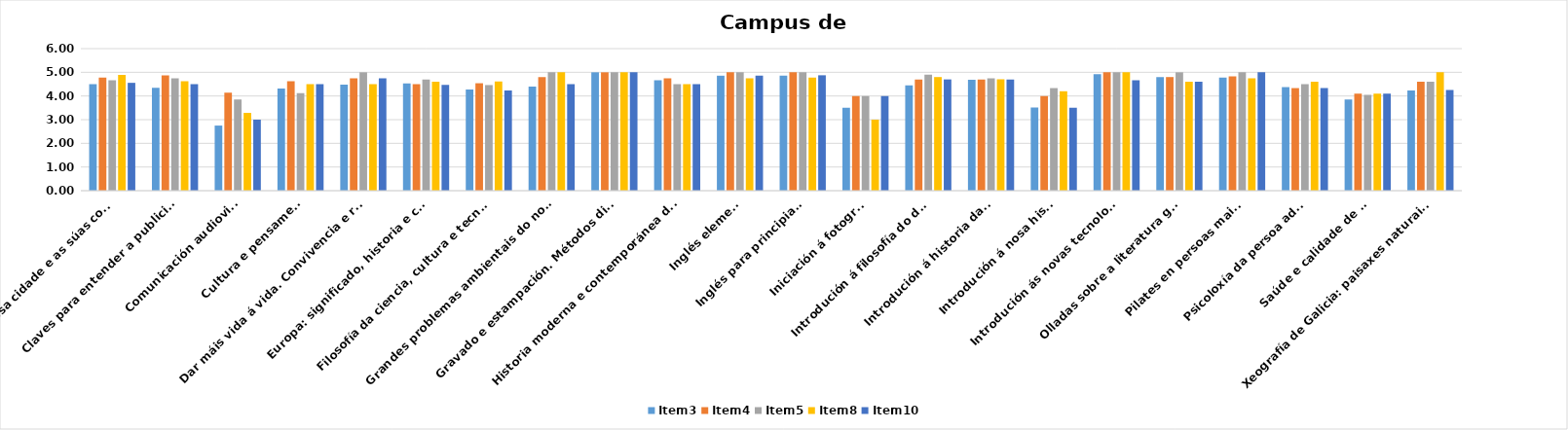
| Category | Item3 | Item4 | Item5 | Item8 | Item10 |
|---|---|---|---|---|---|
| A xenética na Humanidade | 4.472 | 4.364 | 4.545 | 4.417 | 4.273 |
| Aforro e investimento en economías domésticas | 4.292 | 4.667 | 4.5 | 4.5 | 4.318 |
| Aproximación á linguaxe da comunidade xorda española | 4.45 | 4.7 | 4.778 | 4.5 | 4.7 |
| As vanguardias históricas: da ilusión ao excepticismo | 4.641 | 4.719 | 4.781 | 4.667 | 4.667 |
| Bioloxía humana e saúde | 4.544 | 4.785 | 4.776 | 4.683 | 4.682 |
| Botánica Aplicada | 4.786 | 4.85 | 4.85 | 4.762 | 4.842 |
| Ciencia e conservación do patrimonio | 4.727 | 5 | 4.909 | 4.909 | 4.727 |
| Civilización e xeometría | 3.78 | 3.929 | 4 | 3.857 | 4.074 |
| Historia da ciencia, tecnoloxía e cultura: ata o século XIV | 4.549 | 4.615 | 4.667 | 4.478 | 4.556 |
| Historia da Química | 4.423 | 4.462 | 4.385 | 4.583 | 4.545 |
| Historia de Galicia | 3.5 | 3.778 | 3.444 | 3.375 | 3.333 |
| Inglés I | 4.061 | 4.364 | 4.1 | 4.5 | 4.3 |
| Inglés II | 4.833 | 5 | 5 | 4.75 | 4.75 |
| Inglés III | 4.546 | 4.842 | 4.9 | 4.7 | 4.8 |
| Introdución á elaboración de guións cinematográficos | 4.851 | 4.929 | 4.923 | 4.857 | 4.857 |
| Introdución á informática | 3.955 | 4.556 | 4.455 | 4.182 | 4.182 |
| Introdución ás novas tecnoloxías II | 4.792 | 4.75 | 5 | 4 | 4.5 |
| Lingua galega | 4.417 | 4.5 | 4.583 | 4.333 | 4.545 |
| Linguaxe musical e educación auditiva | 4.346 | 4.667 | 4.692 | 4.583 | 4.538 |
| Linguaxe musical e educación auditiva II | 4.5 | 4.875 | 4.889 | 4.75 | 4.75 |
| Matemáticas recreativas | 3.75 | 4 | 3.8 | 4 | 4 |
| Miguel de Cervantes: novelas exemplares | 4.659 | 4.71 | 4.806 | 4.679 | 4.741 |
| Mitoloxía e épica xermánicas | 4.652 | 4.576 | 4.688 | 4.786 | 4.545 |
| Novas Tecnoloxías | 4.553 | 4.818 | 4.727 | 4.455 | 4.6 |
| Olladas sobre a literatura galega | 4.55 | 4.889 | 4.8 | 4.7 | 4.9 |
| Panorámica do cine español dos anos 50 | 4.663 | 4.7 | 4.619 | 4.619 | 4.667 |
| Pensamento racional e científico | 4.217 | 4.35 | 4.421 | 4.158 | 4.263 |
| Plantas silvestres comestibles e medicinais | 4.392 | 4.529 | 4.562 | 4.294 | 4.471 |
| Psicoloxía na idade adulta I | 4.447 | 4.316 | 4.389 | 4.421 | 4.579 |
| Psicoloxía na idade adulta II | 4.767 | 4.8 | 5 | 4.929 | 4.733 |
| Recursos minerais: usos e explotación sostible | 4.712 | 4.667 | 4.667 | 4.75 | 4.615 |
| Setvzos de aplicacions de Internet | 5 | 5 | 5 | 5 | 5 |
| Taller de Artes creativas | 4.409 | 4.619 | 4.773 | 4.682 | 4.682 |
| Taller de física básica e astronomía recreativa | 4.289 | 4.471 | 4.562 | 4.2 | 4.5 |
| Zooloxía: a diversidade do mundo animal | 4.926 | 4.943 | 4.917 | 4.919 | 4.944 |